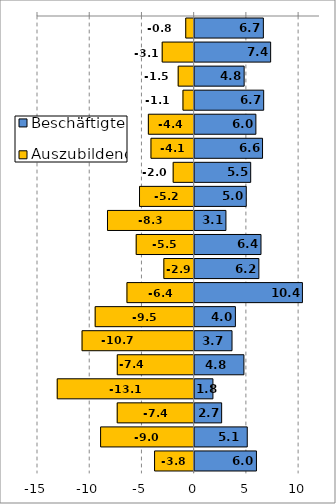
| Category | Beschäftigte | Auszubildende |
|---|---|---|
| 0 | 6.674 | -0.806 |
| 1 | 7.371 | -3.06 |
| 2 | 4.833 | -1.53 |
| 3 | 6.704 | -1.071 |
| 4 | 5.957 | -4.385 |
| 5 | 6.595 | -4.135 |
| 6 | 5.46 | -2.009 |
| 7 | 5.035 | -5.231 |
| 8 | 3.089 | -8.298 |
| 9 | 6.446 | -5.55 |
| 10 | 6.243 | -2.903 |
| 11 | 10.414 | -6.435 |
| 12 | 3.995 | -9.477 |
| 13 | 3.672 | -10.733 |
| 14 | 4.81 | -7.36 |
| 15 | 1.844 | -13.11 |
| 16 | 2.68 | -7.366 |
| 17 | 5.131 | -8.958 |
| 18 | 6.01 | -3.791 |